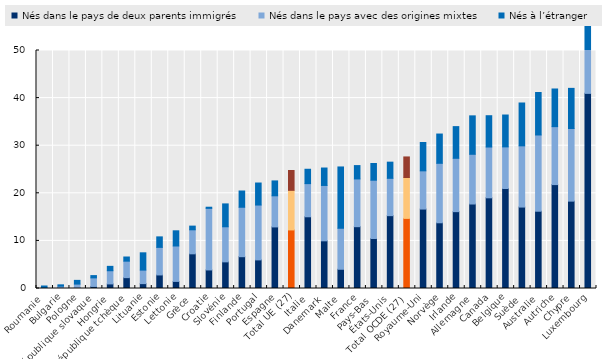
| Category | Nés dans le pays de deux parents immigrés | Nés dans le pays avec des origines mixtes | Nés à l’étranger |
|---|---|---|---|
| Roumanie | 0.02 | 0.163 | 0.343 |
| Bulgarie | 0.149 | 0.34 | 0.278 |
| Pologne | 0.135 | 0.791 | 0.782 |
| République slovaque | 0.437 | 1.797 | 0.476 |
| Hongrie | 0.961 | 2.773 | 0.919 |
| République tchèque | 2.279 | 3.464 | 0.873 |
| Lituanie | 1.024 | 2.841 | 3.633 |
| Estonie | 2.848 | 5.792 | 2.205 |
| Lettonie | 1.49 | 7.44 | 3.191 |
| Grèce | 7.286 | 5.046 | 0.774 |
| Croatie | 3.899 | 12.936 | 0.24 |
| Slovénie | 5.597 | 7.37 | 4.806 |
| Finlande | 6.681 | 10.387 | 3.415 |
| Portugal | 6.01 | 11.524 | 4.626 |
| Espagne | 12.936 | 6.537 | 3.13 |
| Total UE (27) | 12.306 | 8.316 | 4.164 |
| Italie | 15.068 | 6.964 | 3.018 |
| Danemark | 10.017 | 11.631 | 3.663 |
| Malte | 4.04 | 8.617 | 12.877 |
| France | 12.987 | 10.031 | 2.803 |
| Pays-Bas | 10.509 | 12.241 | 3.514 |
| États-Unis | 15.303 | 7.843 | 3.397 |
| Total OCDE (27) | 14.728 | 8.591 | 4.319 |
| Royaume-Uni | 16.69 | 8.03 | 5.95 |
| Norvège | 13.807 | 12.496 | 6.148 |
| Irlande | 16.145 | 11.209 | 6.655 |
| Allemagne | 17.749 | 10.448 | 8.073 |
| Canada | 19.051 | 10.671 | 6.578 |
| Belgique | 21.011 | 8.741 | 6.695 |
| Suède | 17.107 | 12.865 | 9 |
| Australie | 16.235 | 16.019 | 8.918 |
| Autriche | 21.829 | 12.173 | 7.913 |
| Chypre | 18.354 | 15.253 | 8.437 |
| Luxembourg | 40.993 | 15.864 | 20.916 |